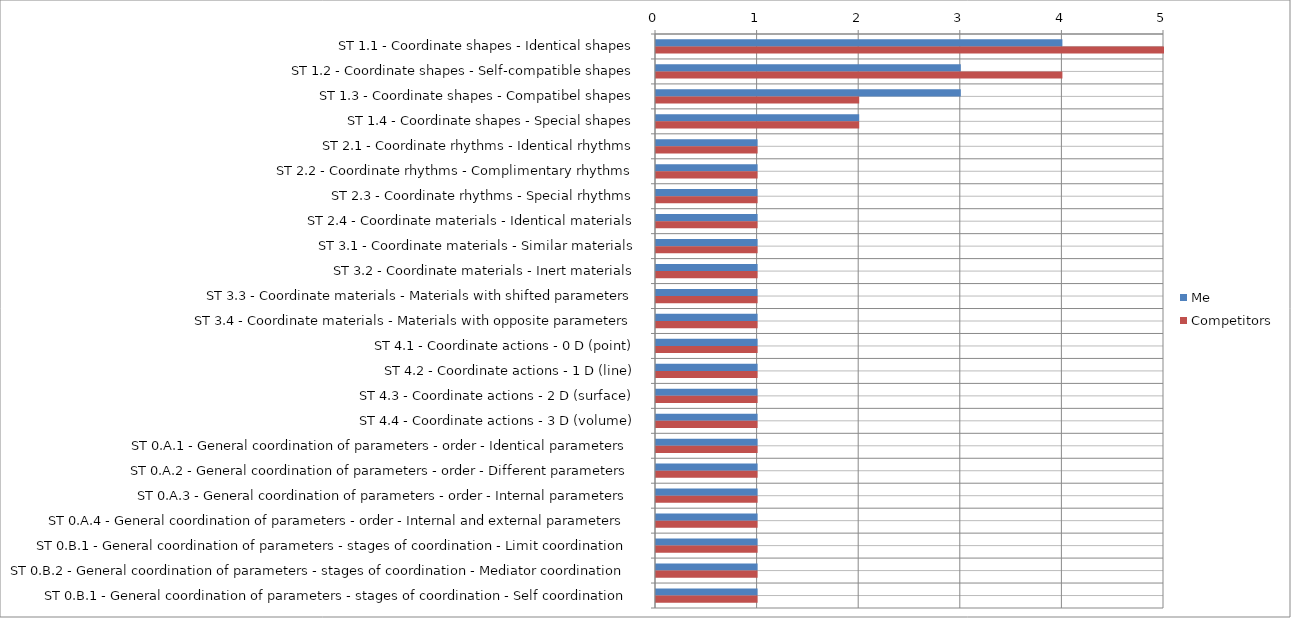
| Category | Me | Competitors |
|---|---|---|
| ST 1.1 - Coordinate shapes - Identical shapes | 4 | 5 |
| ST 1.2 - Coordinate shapes - Self-compatible shapes | 3 | 4 |
| ST 1.3 - Coordinate shapes - Compatibel shapes | 3 | 2 |
| ST 1.4 - Coordinate shapes - Special shapes | 2 | 2 |
| ST 2.1 - Coordinate rhythms - Identical rhythms | 1 | 1 |
| ST 2.2 - Coordinate rhythms - Complimentary rhythms | 1 | 1 |
| ST 2.3 - Coordinate rhythms - Special rhythms | 1 | 1 |
| ST 2.4 - Coordinate materials - Identical materials | 1 | 1 |
| ST 3.1 - Coordinate materials - Similar materials | 1 | 1 |
| ST 3.2 - Coordinate materials - Inert materials | 1 | 1 |
| ST 3.3 - Coordinate materials - Materials with shifted parameters | 1 | 1 |
| ST 3.4 - Coordinate materials - Materials with opposite parameters | 1 | 1 |
| ST 4.1 - Coordinate actions - 0 D (point) | 1 | 1 |
| ST 4.2 - Coordinate actions - 1 D (line) | 1 | 1 |
| ST 4.3 - Coordinate actions - 2 D (surface) | 1 | 1 |
| ST 4.4 - Coordinate actions - 3 D (volume) | 1 | 1 |
| ST 0.A.1 - General coordination of parameters - order - Identical parameters | 1 | 1 |
| ST 0.A.2 - General coordination of parameters - order - Different parameters | 1 | 1 |
| ST 0.A.3 - General coordination of parameters - order - Internal parameters | 1 | 1 |
| ST 0.A.4 - General coordination of parameters - order - Internal and external parameters | 1 | 1 |
| ST 0.B.1 - General coordination of parameters - stages of coordination - Limit coordination | 1 | 1 |
| ST 0.B.2 - General coordination of parameters - stages of coordination - Mediator coordination | 1 | 1 |
| ST 0.B.1 - General coordination of parameters - stages of coordination - Self coordination | 1 | 1 |